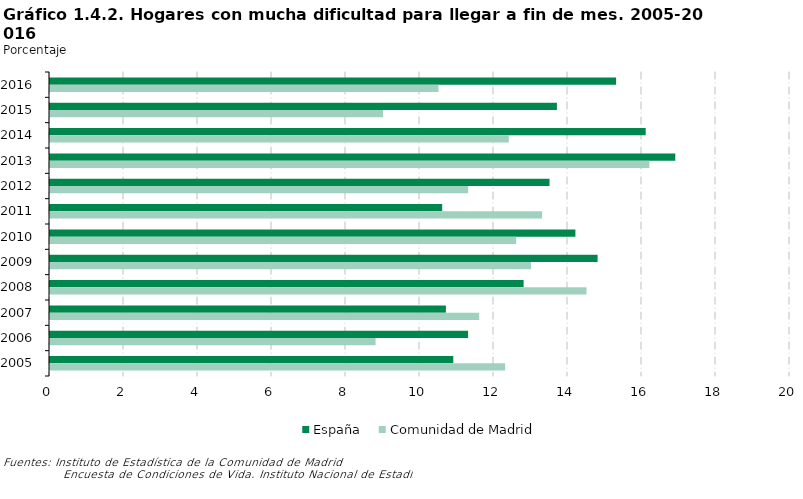
| Category | España | Comunidad de Madrid |
|---|---|---|
| 2016 | 15.3 | 10.5 |
| 2015 | 13.7 | 9 |
| 2014 | 16.1 | 12.4 |
| 2013 | 16.9 | 16.2 |
| 2012 | 13.5 | 11.3 |
| 2011 | 10.6 | 13.3 |
| 2010 | 14.2 | 12.6 |
| 2009 | 14.8 | 13 |
| 2008 | 12.8 | 14.5 |
| 2007 | 10.7 | 11.6 |
| 2006 | 11.3 | 8.8 |
| 2005 | 10.9 | 12.3 |